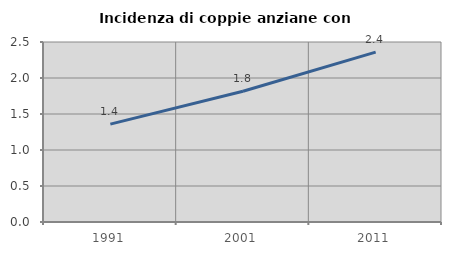
| Category | Incidenza di coppie anziane con figli |
|---|---|
| 1991.0 | 1.359 |
| 2001.0 | 1.815 |
| 2011.0 | 2.359 |